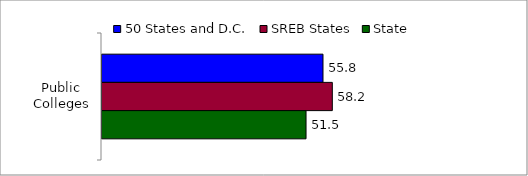
| Category | 50 States and D.C. | SREB States | State |
|---|---|---|---|
| Public Colleges | 55.806 | 58.163 | 51.525 |